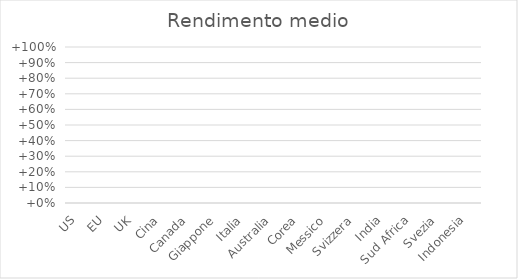
| Category | Rendimento medio |
|---|---|
| US | 0 |
| EU | 0 |
| UK | 0 |
| Cina | 0 |
| Canada | 0 |
| Giappone | 0 |
| Italia | 0 |
| Australia | 0 |
| Corea | 0 |
| Messico | 0 |
| Svizzera | 0 |
| India | 0 |
| Sud Africa | 0 |
| Svezia | 0 |
| Indonesia | 0 |